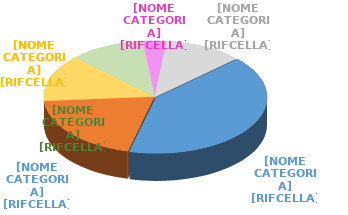
| Category | Series 0 |
|---|---|
| Scuola | 29477 |
| Servizio Sanitario Nazionale | 14378 |
| Corpi di Polizia | 9835 |
| Regioni ed autonomie locali | 7830 |
| Ministeri | 2498 |
| Altri comparti | 8190 |